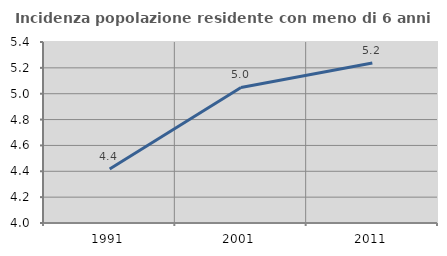
| Category | Incidenza popolazione residente con meno di 6 anni |
|---|---|
| 1991.0 | 4.418 |
| 2001.0 | 5.049 |
| 2011.0 | 5.237 |